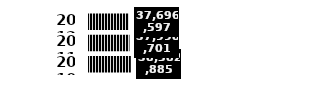
| Category | Series 0 |
|---|---|
| 2010.0 | 38582885 |
| 2011.0 | 37998701 |
| 2012.0 | 37696597 |